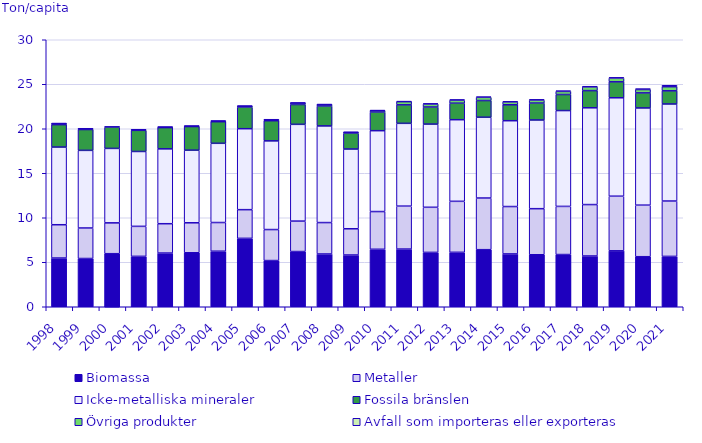
| Category | Biomassa | Metaller | Icke-metalliska mineraler | Fossila bränslen | Övriga produkter | Avfall som importeras eller exporteras |
|---|---|---|---|---|---|---|
| 1998.0 | 5.474 | 3.742 | 8.726 | 2.52 | 0.122 | 0 |
| 1999.0 | 5.42 | 3.429 | 8.722 | 2.341 | 0.088 | 0 |
| 2000.0 | 5.961 | 3.466 | 8.366 | 2.374 | 0.099 | 0 |
| 2001.0 | 5.663 | 3.37 | 8.413 | 2.377 | 0.062 | 0 |
| 2002.0 | 6.033 | 3.296 | 8.412 | 2.386 | 0.059 | 0 |
| 2003.0 | 6.065 | 3.368 | 8.159 | 2.656 | 0.053 | 0 |
| 2004.0 | 6.24 | 3.224 | 8.9 | 2.428 | 0.078 | 0 |
| 2005.0 | 7.684 | 3.224 | 9.095 | 2.423 | 0.123 | 0.002 |
| 2006.0 | 5.19 | 3.483 | 9.966 | 2.264 | 0.111 | 0.001 |
| 2007.0 | 6.204 | 3.419 | 10.873 | 2.228 | 0.178 | 0.001 |
| 2008.0 | 5.927 | 3.531 | 10.86 | 2.236 | 0.167 | 0.003 |
| 2009.0 | 5.814 | 2.947 | 8.961 | 1.772 | 0.11 | 0.017 |
| 2010.0 | 6.457 | 4.238 | 9.087 | 2.093 | 0.168 | 0.031 |
| 2011.0 | 6.481 | 4.823 | 9.303 | 2.079 | 0.358 | 0.049 |
| 2012.0 | 6.107 | 5.069 | 9.346 | 1.919 | 0.343 | 0.056 |
| 2013.0 | 6.115 | 5.73 | 9.172 | 1.854 | 0.347 | 0.058 |
| 2014.0 | 6.413 | 5.804 | 9.078 | 1.876 | 0.362 | 0.069 |
| 2015.0 | 5.935 | 5.324 | 9.644 | 1.791 | 0.325 | 0.068 |
| 2016.0 | 5.842 | 5.178 | 9.964 | 1.901 | 0.341 | 0.072 |
| 2017.0 | 5.866 | 5.409 | 10.769 | 1.804 | 0.349 | 0.075 |
| 2018.0 | 5.704 | 5.778 | 10.874 | 1.93 | 0.421 | 0.072 |
| 2019.0 | 6.283 | 6.138 | 11.06 | 1.792 | 0.424 | 0.075 |
| 2020.0 | 5.622 | 5.793 | 10.921 | 1.691 | 0.382 | 0.096 |
| 2021.0 | 5.657 | 6.223 | 10.901 | 1.482 | 0.46 | 0.164 |